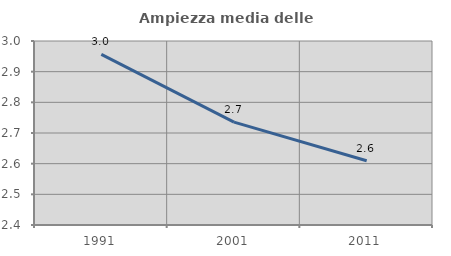
| Category | Ampiezza media delle famiglie |
|---|---|
| 1991.0 | 2.957 |
| 2001.0 | 2.735 |
| 2011.0 | 2.609 |